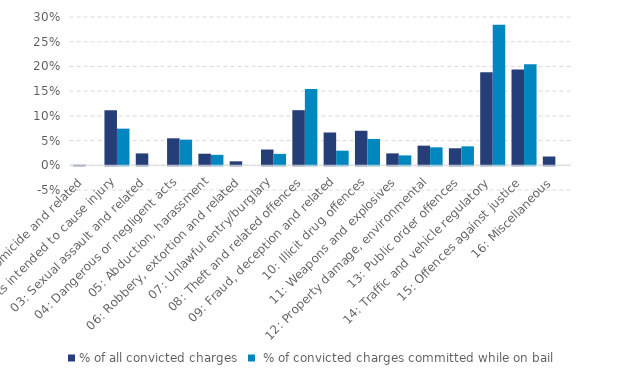
| Category | % of all convicted charges |  % of convicted charges committed while on bail |
|---|---|---|
| 01: Homicide and related | 0.001 | 0 |
| 02: Acts intended to cause injury | 0.111 | 0.074 |
| 03: Sexual assault and related | 0.024 | 0 |
| 04: Dangerous or negligent acts | 0.055 | 0.052 |
| 05: Abduction, harassment | 0.023 | 0.021 |
| 06: Robbery, extortion and related | 0.008 | 0 |
| 07: Unlawful entry/burglary | 0.032 | 0.023 |
| 08: Theft and related offences | 0.111 | 0.154 |
| 09: Fraud, deception and related | 0.066 | 0.03 |
| 10: Illicit drug offences | 0.07 | 0.053 |
| 11: Weapons and explosives | 0.024 | 0.02 |
| 12: Property damage, environmental | 0.04 | 0.036 |
| 13: Public order offences | 0.034 | 0.038 |
| 14: Traffic and vehicle regulatory | 0.188 | 0.284 |
| 15: Offences against justice | 0.194 | 0.205 |
| 16: Miscellaneous | 0.018 | 0 |